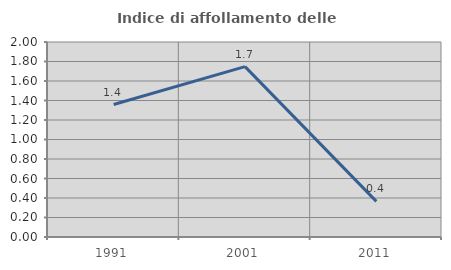
| Category | Indice di affollamento delle abitazioni  |
|---|---|
| 1991.0 | 1.359 |
| 2001.0 | 1.747 |
| 2011.0 | 0.365 |